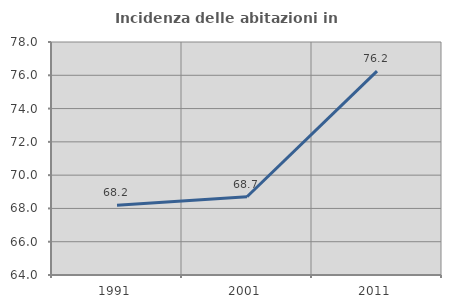
| Category | Incidenza delle abitazioni in proprietà  |
|---|---|
| 1991.0 | 68.195 |
| 2001.0 | 68.704 |
| 2011.0 | 76.246 |